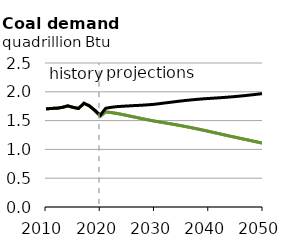
| Category | EAC | DAC | Reference |
|---|---|---|---|
| 2010.0 | 1.703 | 1.703 | 1.703 |
| 2011.0 | 1.711 | 1.711 | 1.711 |
| 2012.0 | 1.715 | 1.715 | 1.715 |
| 2013.0 | 1.729 | 1.729 | 1.729 |
| 2014.0 | 1.756 | 1.756 | 1.756 |
| 2015.0 | 1.729 | 1.729 | 1.729 |
| 2016.0 | 1.71 | 1.71 | 1.71 |
| 2017.0 | 1.801 | 1.801 | 1.801 |
| 2018.0 | 1.755 | 1.755 | 1.755 |
| 2019.0 | 1.67 | 1.67 | 1.681 |
| 2020.0 | 1.575 | 1.575 | 1.594 |
| 2021.0 | 1.65 | 1.65 | 1.714 |
| 2022.0 | 1.64 | 1.64 | 1.73 |
| 2023.0 | 1.626 | 1.626 | 1.742 |
| 2024.0 | 1.607 | 1.607 | 1.748 |
| 2025.0 | 1.587 | 1.587 | 1.754 |
| 2026.0 | 1.568 | 1.568 | 1.759 |
| 2027.0 | 1.548 | 1.548 | 1.764 |
| 2028.0 | 1.528 | 1.528 | 1.769 |
| 2029.0 | 1.509 | 1.509 | 1.776 |
| 2030.0 | 1.491 | 1.491 | 1.784 |
| 2031.0 | 1.475 | 1.475 | 1.796 |
| 2032.0 | 1.46 | 1.46 | 1.807 |
| 2033.0 | 1.443 | 1.443 | 1.819 |
| 2034.0 | 1.427 | 1.427 | 1.831 |
| 2035.0 | 1.41 | 1.41 | 1.842 |
| 2036.0 | 1.392 | 1.392 | 1.852 |
| 2037.0 | 1.373 | 1.373 | 1.862 |
| 2038.0 | 1.354 | 1.354 | 1.87 |
| 2039.0 | 1.334 | 1.334 | 1.878 |
| 2040.0 | 1.313 | 1.313 | 1.884 |
| 2041.0 | 1.292 | 1.292 | 1.89 |
| 2042.0 | 1.271 | 1.271 | 1.897 |
| 2043.0 | 1.25 | 1.25 | 1.903 |
| 2044.0 | 1.229 | 1.229 | 1.911 |
| 2045.0 | 1.208 | 1.208 | 1.919 |
| 2046.0 | 1.188 | 1.188 | 1.928 |
| 2047.0 | 1.168 | 1.167 | 1.937 |
| 2048.0 | 1.147 | 1.147 | 1.948 |
| 2049.0 | 1.127 | 1.127 | 1.959 |
| 2050.0 | 1.107 | 1.107 | 1.969 |